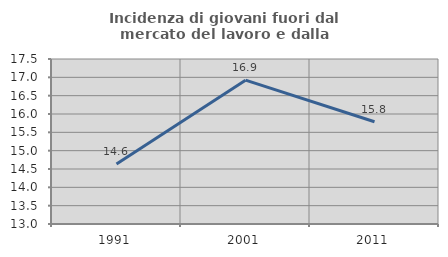
| Category | Incidenza di giovani fuori dal mercato del lavoro e dalla formazione  |
|---|---|
| 1991.0 | 14.634 |
| 2001.0 | 16.923 |
| 2011.0 | 15.789 |